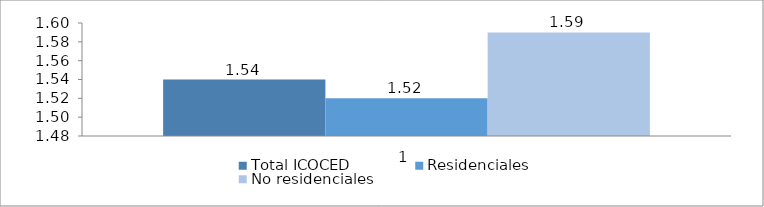
| Category | Total ICOCED | Residenciales | No residenciales |
|---|---|---|---|
| 0 | 1.54 | 1.52 | 1.59 |